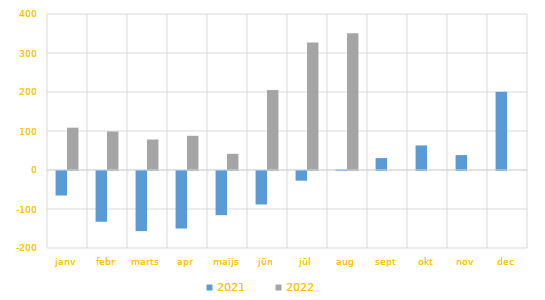
| Category | 2021 | 2022 |
|---|---|---|
| janv | -62808.075 | 108554.179 |
| febr | -130183.513 | 98735.641 |
| marts | -154114.179 | 78145.563 |
| apr | -147503.301 | 87696.664 |
| maijs | -113180.114 | 41467.941 |
| jūn | -85892.075 | 205002.224 |
| jūl | -24790.077 | 326863.351 |
| aug | 1407.353 | 350378.42 |
| sept | 30609.788 | 0 |
| okt | 63006.825 | 0 |
| nov | 38267.962 | 0 |
| dec | 200524.486 | 0 |